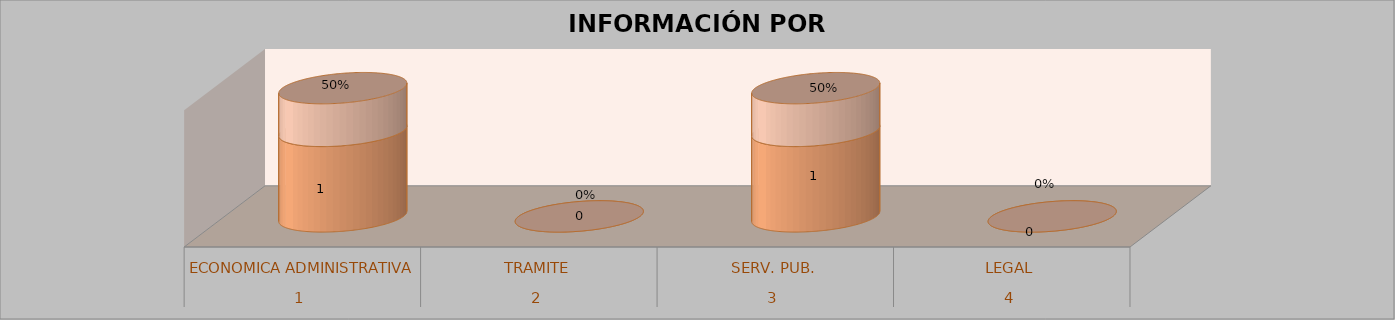
| Category | Series 0 | Series 1 | Series 2 | Series 3 |
|---|---|---|---|---|
| 0 |  |  | 1 | 0.5 |
| 1 |  |  | 0 | 0 |
| 2 |  |  | 1 | 0.5 |
| 3 |  |  | 0 | 0 |